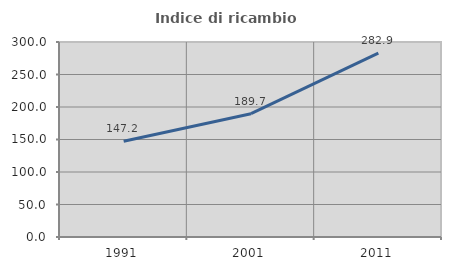
| Category | Indice di ricambio occupazionale  |
|---|---|
| 1991.0 | 147.205 |
| 2001.0 | 189.655 |
| 2011.0 | 282.883 |